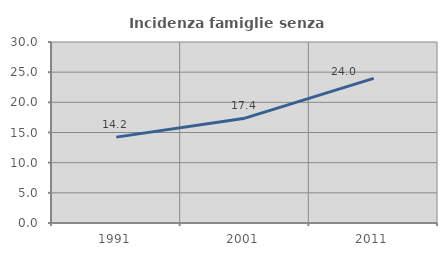
| Category | Incidenza famiglie senza nuclei |
|---|---|
| 1991.0 | 14.231 |
| 2001.0 | 17.375 |
| 2011.0 | 23.972 |